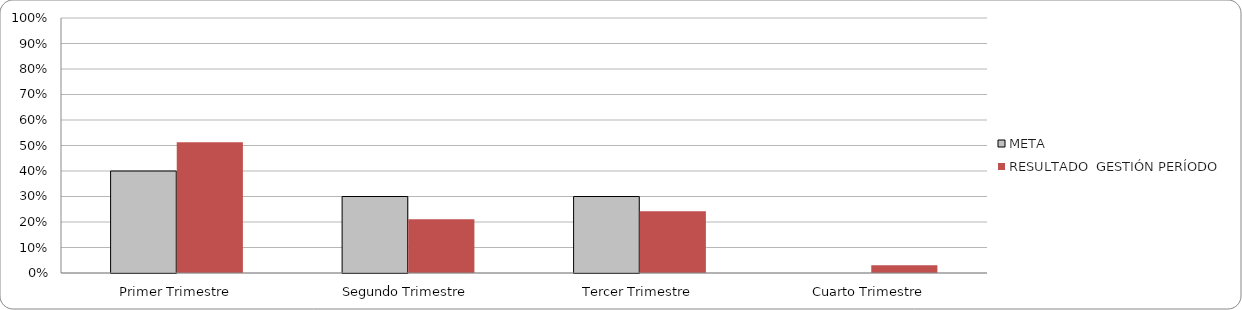
| Category | META | RESULTADO  GESTIÓN PERÍODO |
|---|---|---|
| Primer Trimestre | 0.4 | 0.513 |
| Segundo Trimestre | 0.3 | 0.211 |
| Tercer Trimestre | 0.3 | 0.242 |
| Cuarto Trimestre | 0 | 0.03 |